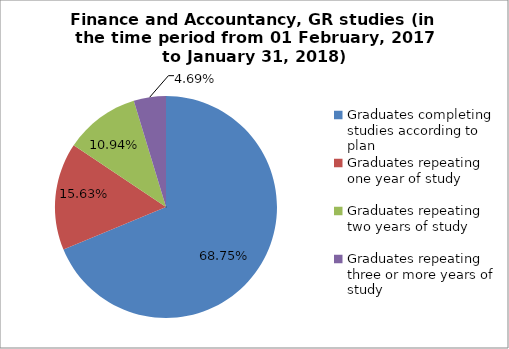
| Category | Series 0 |
|---|---|
| Graduates completing studies according to plan | 68.75 |
| Graduates repeating one year of study | 15.625 |
| Graduates repeating two years of study | 10.938 |
| Graduates repeating three or more years of study | 4.688 |